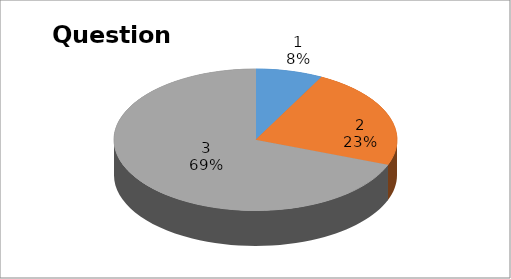
| Category | Series 0 |
|---|---|
| 0 | 3 |
| 1 | 9 |
| 2 | 27 |